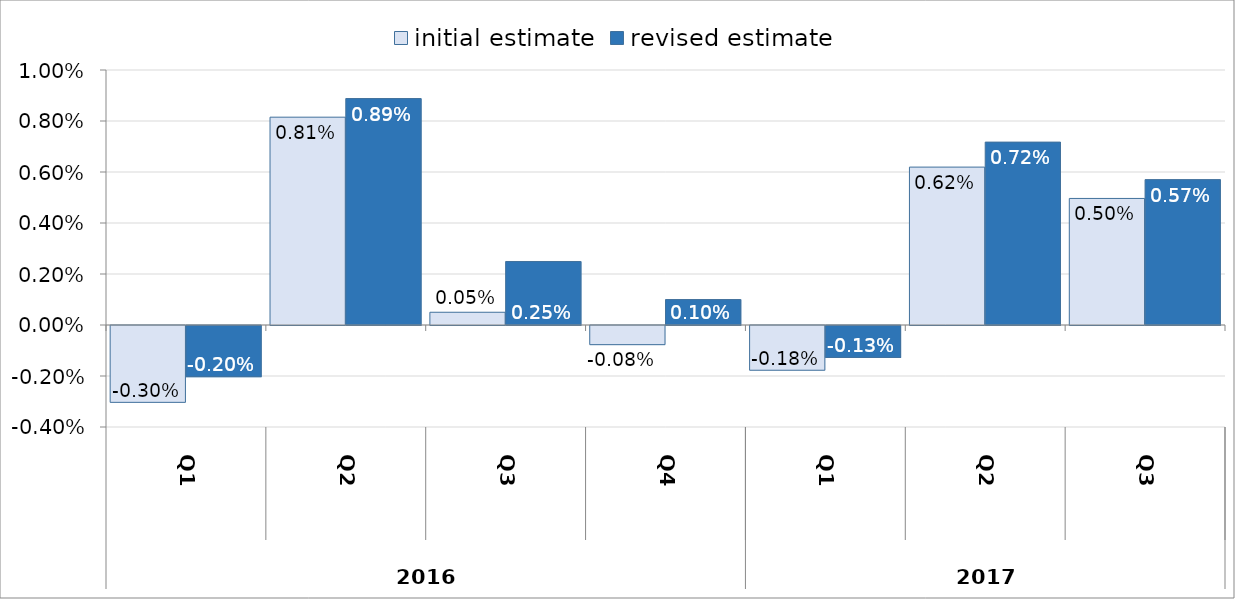
| Category | initial estimate | revised estimate |
|---|---|---|
| 0 | -0.003 | -0.002 |
| 1 | 0.008 | 0.009 |
| 2 | 0 | 0.002 |
| 3 | -0.001 | 0.001 |
| 4 | -0.002 | -0.001 |
| 5 | 0.006 | 0.007 |
| 6 | 0.005 | 0.006 |